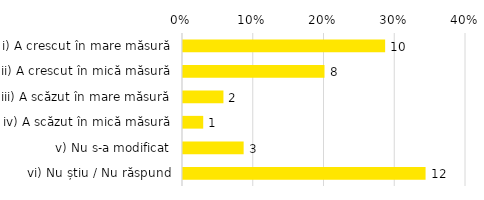
| Category | Total |
|---|---|
| i) A crescut în mare măsură | 0.286 |
| ii) A crescut în mică măsură | 0.2 |
| iii) A scăzut în mare măsură | 0.057 |
| iv) A scăzut în mică măsură | 0.029 |
| v) Nu s-a modificat | 0.086 |
| vi) Nu știu / Nu răspund | 0.343 |